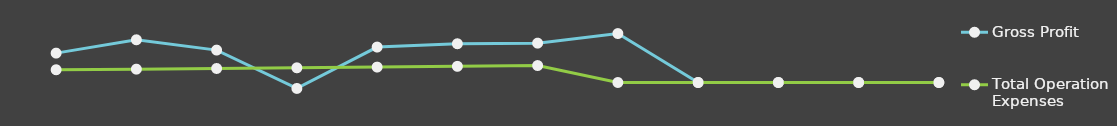
| Category | Gross Profit | Total Operation Expenses |
|---|---|---|
| 0 | 25000 | 10841 |
| 1 | 36348 | 11367.25 |
| 2 | 27562 | 11919.82 |
| 3 | -5059.5 | 12500.01 |
| 4 | 30153.18 | 13109.21 |
| 5 | 32964.45 | 13748.86 |
| 6 | 33502.87 | 14420.51 |
| 7 | 41646 | 0 |
| 8 | 0 | 0 |
| 9 | 0 | 0 |
| 10 | 0 | 0 |
| 11 | 0 | 0 |